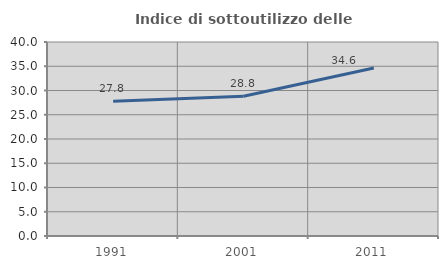
| Category | Indice di sottoutilizzo delle abitazioni  |
|---|---|
| 1991.0 | 27.778 |
| 2001.0 | 28.804 |
| 2011.0 | 34.641 |